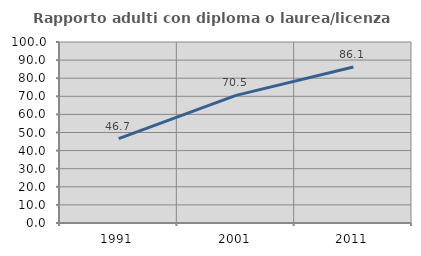
| Category | Rapporto adulti con diploma o laurea/licenza media  |
|---|---|
| 1991.0 | 46.651 |
| 2001.0 | 70.531 |
| 2011.0 | 86.145 |